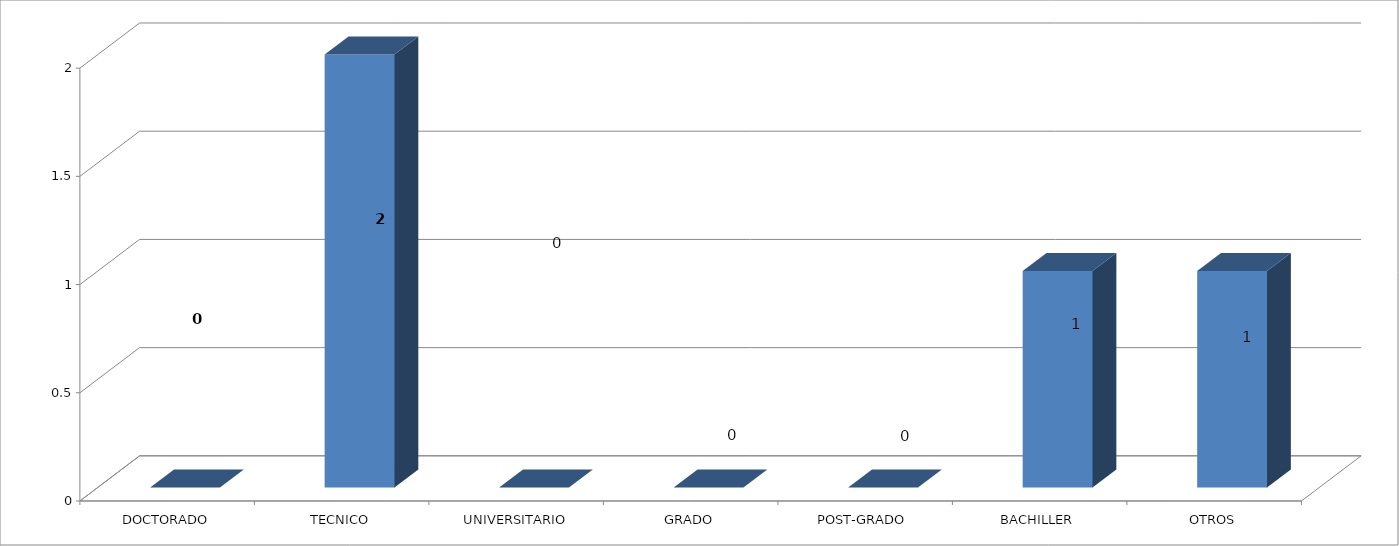
| Category | Series 0 |
|---|---|
| DOCTORADO | 0 |
| TECNICO | 2 |
| UNIVERSITARIO | 0 |
| GRADO | 0 |
| POST-GRADO  | 0 |
| BACHILLER | 1 |
| OTROS | 1 |